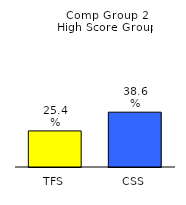
| Category | Series 0 |
|---|---|
| TFS | 0.254 |
| CSS | 0.386 |